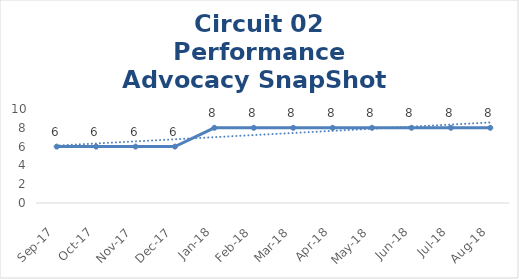
| Category | Circuit 02 |
|---|---|
| Sep-17 | 6 |
| Oct-17 | 6 |
| Nov-17 | 6 |
| Dec-17 | 6 |
| Jan-18 | 8 |
| Feb-18 | 8 |
| Mar-18 | 8 |
| Apr-18 | 8 |
| May-18 | 8 |
| Jun-18 | 8 |
| Jul-18 | 8 |
| Aug-18 | 8 |